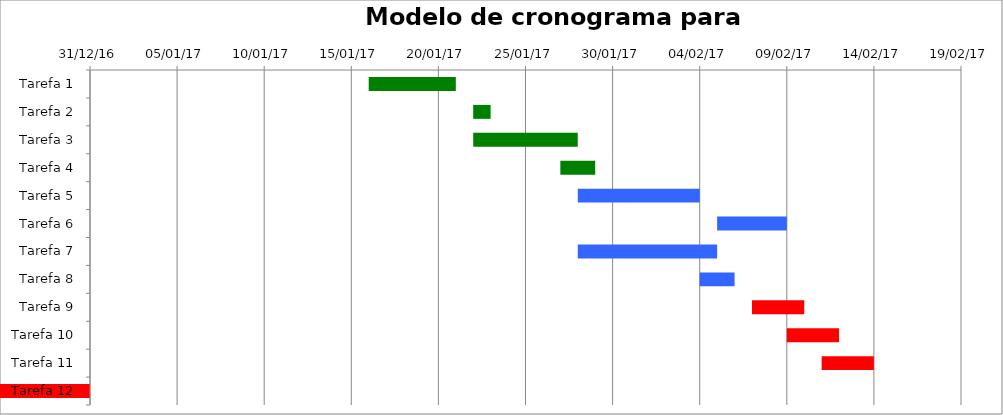
| Category | Início | Duração (dias) |
|---|---|---|
| Tarefa 1 | 2017-01-16 | 5 |
| Tarefa 2 | 2017-01-22 | 1 |
| Tarefa 3 | 2017-01-22 | 6 |
| Tarefa 4 | 2017-01-27 | 2 |
| Tarefa 5 | 2017-01-28 | 7 |
| Tarefa 6 | 2017-02-05 | 4 |
| Tarefa 7 | 2017-01-28 | 8 |
| Tarefa 8 | 2017-02-04 | 2 |
| Tarefa 9 | 2017-02-07 | 3 |
| Tarefa 10 | 2017-02-09 | 3 |
| Tarefa 11 | 2017-02-11 | 3 |
| Tarefa 12 | 2015-02-15 | 2 |